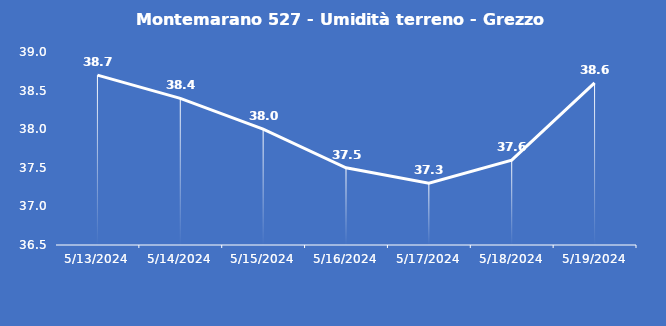
| Category | Montemarano 527 - Umidità terreno - Grezzo (%VWC) |
|---|---|
| 5/13/24 | 38.7 |
| 5/14/24 | 38.4 |
| 5/15/24 | 38 |
| 5/16/24 | 37.5 |
| 5/17/24 | 37.3 |
| 5/18/24 | 37.6 |
| 5/19/24 | 38.6 |